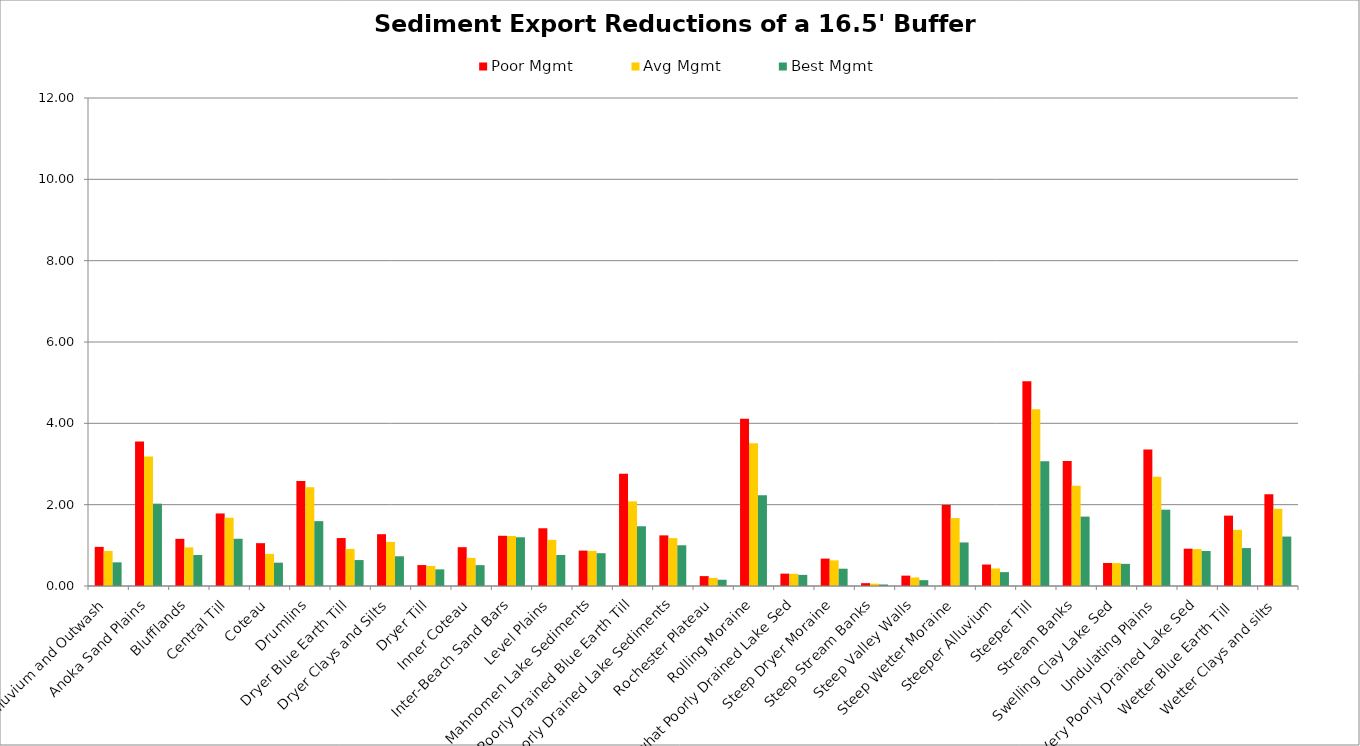
| Category | Poor Mgmt | Avg Mgmt | Best Mgmt |
|---|---|---|---|
| Alluvium and Outwash | 0.962 | 0.862 | 0.582 |
| Anoka Sand Plains | 3.552 | 3.185 | 2.025 |
| Blufflands | 1.16 | 0.949 | 0.762 |
| Central Till | 1.784 | 1.678 | 1.161 |
| Coteau | 1.053 | 0.789 | 0.573 |
| Drumlins | 2.581 | 2.43 | 1.595 |
| Dryer Blue Earth Till | 1.179 | 0.911 | 0.638 |
| Dryer Clays and Silts | 1.274 | 1.085 | 0.731 |
| Dryer Till | 0.515 | 0.493 | 0.409 |
| Inner Coteau | 0.955 | 0.692 | 0.513 |
| Inter-Beach Sand Bars | 1.235 | 1.23 | 1.198 |
| Level Plains | 1.42 | 1.134 | 0.762 |
| Mahnomen Lake Sediments | 0.87 | 0.862 | 0.807 |
| Poorly Drained Blue Earth Till | 2.761 | 2.08 | 1.469 |
| Poorly Drained Lake Sediments | 1.245 | 1.177 | 1.001 |
| Rochester Plateau | 0.243 | 0.199 | 0.154 |
| Rolling Moraine | 4.116 | 3.51 | 2.235 |
| Somewhat Poorly Drained Lake Sed | 0.304 | 0.3 | 0.274 |
| Steep Dryer Moraine | 0.674 | 0.631 | 0.425 |
| Steep Stream Banks | 0.07 | 0.058 | 0.037 |
| Steep Valley Walls | 0.255 | 0.21 | 0.144 |
| Steep Wetter Moraine | 1.994 | 1.671 | 1.071 |
| Steeper Alluvium | 0.528 | 0.432 | 0.341 |
| Steeper Till | 5.035 | 4.347 | 3.066 |
| Stream Banks | 3.072 | 2.462 | 1.706 |
| Swelling Clay Lake Sed | 0.566 | 0.564 | 0.544 |
| Undulating Plains | 3.358 | 2.685 | 1.877 |
| Very Poorly Drained Lake Sed | 0.917 | 0.908 | 0.86 |
| Wetter Blue Earth Till  | 1.731 | 1.381 | 0.933 |
| Wetter Clays and silts | 2.257 | 1.898 | 1.216 |